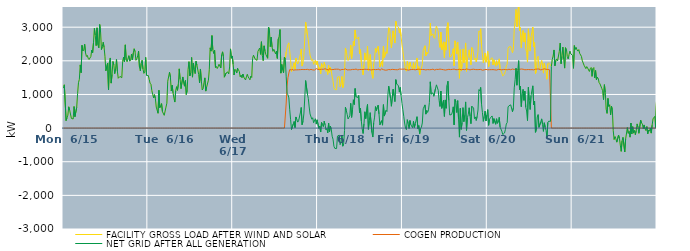
| Category | FACILITY GROSS LOAD AFTER WIND AND SOLAR | COGEN PRODUCTION | NET GRID AFTER ALL GENERATION |
|---|---|---|---|
|  Mon  6/15 | 1189 | 0 | 1189 |
|  Mon  6/15 | 1287 | 0 | 1287 |
|  Mon  6/15 | 1297 | 0 | 1297 |
|  Mon  6/15 | 224 | 0 | 224 |
|  Mon  6/15 | 304 | 0 | 304 |
|  Mon  6/15 | 385 | 0 | 385 |
|  Mon  6/15 | 633 | 0 | 633 |
|  Mon  6/15 | 533 | 0 | 533 |
|  Mon  6/15 | 510 | 0 | 510 |
|  Mon  6/15 | 287 | 0 | 287 |
|  Mon  6/15 | 264 | 0 | 264 |
|  Mon  6/15 | 271 | 0 | 271 |
|  Mon  6/15 | 641 | 0 | 641 |
|  Mon  6/15 | 338 | 0 | 338 |
|  Mon  6/15 | 337 | 0 | 337 |
|  Mon  6/15 | 616 | 0 | 616 |
|  Mon  6/15 | 1022 | 0 | 1022 |
|  Mon  6/15 | 1348 | 0 | 1348 |
|  Mon  6/15 | 1450 | 0 | 1450 |
|  Mon  6/15 | 1878 | 0 | 1878 |
|  Mon  6/15 | 1647 | 0 | 1647 |
|  Mon  6/15 | 2461 | 0 | 2461 |
|  Mon  6/15 | 2292 | 0 | 2292 |
|  Mon  6/15 | 2328 | 0 | 2328 |
|  Mon  6/15 | 2493 | 0 | 2493 |
|  Mon  6/15 | 2235 | 0 | 2235 |
|  Mon  6/15 | 2130 | 0 | 2130 |
|  Mon  6/15 | 2161 | 0 | 2161 |
|  Mon  6/15 | 2076 | 0 | 2076 |
|  Mon  6/15 | 2040 | 0 | 2040 |
|  Mon  6/15 | 2017 | 0 | 2017 |
|  Mon  6/15 | 2129 | 0 | 2129 |
|  Mon  6/15 | 2317 | 0 | 2317 |
|  Mon  6/15 | 2235 | 0 | 2235 |
|  Mon  6/15 | 2535 | 0 | 2535 |
|  Mon  6/15 | 2966 | 0 | 2966 |
|  Mon  6/15 | 2761 | 0 | 2761 |
|  Mon  6/15 | 2452 | 0 | 2452 |
|  Mon  6/15 | 2980 | 0 | 2980 |
|  Mon  6/15 | 2474 | 0 | 2474 |
|  Mon  6/15 | 2386 | 0 | 2386 |
|  Mon  6/15 | 3079 | 0 | 3079 |
|  Mon  6/15 | 2858 | 0 | 2858 |
|  Mon  6/15 | 2334 | 0 | 2334 |
|  Mon  6/15 | 2425 | 0 | 2425 |
|  Mon  6/15 | 2552 | 0 | 2552 |
|  Mon  6/15 | 2398 | 0 | 2398 |
|  Mon  6/15 | 2120 | 0 | 2120 |
|  Mon  6/15 | 1703 | 0 | 1703 |
|  Mon  6/15 | 1725 | 0 | 1725 |
|  Mon  6/15 | 1934 | 0 | 1934 |
|  Mon  6/15 | 1132 | 0 | 1132 |
|  Mon  6/15 | 1962 | 0 | 1962 |
|  Mon  6/15 | 2085 | 0 | 2085 |
|  Mon  6/15 | 1337 | 0 | 1337 |
|  Mon  6/15 | 1595 | 0 | 1595 |
|  Mon  6/15 | 1979 | 0 | 1979 |
|  Mon  6/15 | 1881 | 0 | 1881 |
|  Mon  6/15 | 1618 | 0 | 1618 |
|  Mon  6/15 | 1775 | 0 | 1775 |
|  Mon  6/15 | 2041 | 0 | 2041 |
|  Mon  6/15 | 1698 | 0 | 1698 |
|  Mon  6/15 | 1481 | 0 | 1481 |
|  Mon  6/15 | 1464 | 0 | 1464 |
|  Mon  6/15 | 1537 | 0 | 1537 |
|  Mon  6/15 | 1525 | 0 | 1525 |
|  Mon  6/15 | 1496 | 0 | 1496 |
|  Mon  6/15 | 1984 | 0 | 1984 |
|  Mon  6/15 | 2110 | 0 | 2110 |
|  Mon  6/15 | 1967 | 0 | 1967 |
|  Mon  6/15 | 2475 | 0 | 2475 |
|  Mon  6/15 | 2021 | 0 | 2021 |
|  Mon  6/15 | 1973 | 0 | 1973 |
|  Mon  6/15 | 1949 | 0 | 1949 |
|  Mon  6/15 | 2152 | 0 | 2152 |
|  Mon  6/15 | 1990 | 0 | 1990 |
|  Mon  6/15 | 2025 | 0 | 2025 |
|  Mon  6/15 | 2201 | 0 | 2201 |
|  Mon  6/15 | 2024 | 0 | 2024 |
|  Mon  6/15 | 2230 | 0 | 2230 |
|  Mon  6/15 | 2358 | 0 | 2358 |
|  Mon  6/15 | 2274 | 0 | 2274 |
|  Mon  6/15 | 2017 | 0 | 2017 |
|  Mon  6/15 | 2063 | 0 | 2063 |
|  Mon  6/15 | 2148 | 0 | 2148 |
|  Mon  6/15 | 2287 | 0 | 2287 |
|  Mon  6/15 | 1818 | 0 | 1818 |
|  Mon  6/15 | 1701 | 0 | 1701 |
|  Mon  6/15 | 1924 | 0 | 1924 |
|  Mon  6/15 | 2013 | 0 | 2013 |
|  Mon  6/15 | 1758 | 0 | 1758 |
|  Mon  6/15 | 1627 | 0 | 1627 |
|  Mon  6/15 | 1663 | 0 | 1663 |
|  Mon  6/15 | 2102 | 0 | 2102 |
|  Mon  6/15 | 1569 | 0 | 1569 |
|  Mon  6/15 | 1593 | 0 | 1593 |
|  Tue  6/16 | 1562 | 0 | 1562 |
|  Tue  6/16 | 1452 | 0 | 1452 |
|  Tue  6/16 | 1335 | 0 | 1335 |
|  Tue  6/16 | 1305 | 0 | 1305 |
|  Tue  6/16 | 1116 | 0 | 1116 |
|  Tue  6/16 | 1003 | 0 | 1003 |
|  Tue  6/16 | 898 | 0 | 898 |
|  Tue  6/16 | 992 | 0 | 992 |
|  Tue  6/16 | 882 | 0 | 882 |
|  Tue  6/16 | 625 | 0 | 625 |
|  Tue  6/16 | 604 | 0 | 604 |
|  Tue  6/16 | 441 | 0 | 441 |
|  Tue  6/16 | 1124 | 0 | 1124 |
|  Tue  6/16 | 606 | 0 | 606 |
|  Tue  6/16 | 662 | 0 | 662 |
|  Tue  6/16 | 728 | 0 | 728 |
|  Tue  6/16 | 489 | 0 | 489 |
|  Tue  6/16 | 495 | 0 | 495 |
|  Tue  6/16 | 379 | 0 | 379 |
|  Tue  6/16 | 408 | 0 | 408 |
|  Tue  6/16 | 624 | 0 | 624 |
|  Tue  6/16 | 741 | 0 | 741 |
|  Tue  6/16 | 1394 | 0 | 1394 |
|  Tue  6/16 | 1409 | 0 | 1409 |
|  Tue  6/16 | 1660 | 0 | 1660 |
|  Tue  6/16 | 1519 | 0 | 1519 |
|  Tue  6/16 | 1103 | 0 | 1103 |
|  Tue  6/16 | 1274 | 0 | 1274 |
|  Tue  6/16 | 1047 | 0 | 1047 |
|  Tue  6/16 | 889 | 0 | 889 |
|  Tue  6/16 | 774 | 0 | 774 |
|  Tue  6/16 | 1114 | 0 | 1114 |
|  Tue  6/16 | 1230 | 0 | 1230 |
|  Tue  6/16 | 1122 | 0 | 1122 |
|  Tue  6/16 | 1305 | 0 | 1305 |
|  Tue  6/16 | 1761 | 0 | 1761 |
|  Tue  6/16 | 1448 | 0 | 1448 |
|  Tue  6/16 | 1172 | 0 | 1172 |
|  Tue  6/16 | 1156 | 0 | 1156 |
|  Tue  6/16 | 1520 | 0 | 1520 |
|  Tue  6/16 | 1539 | 0 | 1539 |
|  Tue  6/16 | 1247 | 0 | 1247 |
|  Tue  6/16 | 1416 | 0 | 1416 |
|  Tue  6/16 | 1001 | 0 | 1001 |
|  Tue  6/16 | 1123 | 0 | 1123 |
|  Tue  6/16 | 1735 | 0 | 1735 |
|  Tue  6/16 | 1973 | 0 | 1973 |
|  Tue  6/16 | 1552 | 0 | 1552 |
|  Tue  6/16 | 1647 | 0 | 1647 |
|  Tue  6/16 | 2100 | 0 | 2100 |
|  Tue  6/16 | 1515 | 0 | 1515 |
|  Tue  6/16 | 1935 | 0 | 1935 |
|  Tue  6/16 | 1736 | 0 | 1736 |
|  Tue  6/16 | 1621 | 0 | 1621 |
|  Tue  6/16 | 1985 | 0 | 1985 |
|  Tue  6/16 | 1870 | 0 | 1870 |
|  Tue  6/16 | 1895 | 0 | 1895 |
|  Tue  6/16 | 1594 | 0 | 1594 |
|  Tue  6/16 | 1345 | 0 | 1345 |
|  Tue  6/16 | 1757 | 0 | 1757 |
|  Tue  6/16 | 1405 | 0 | 1405 |
|  Tue  6/16 | 1133 | 0 | 1133 |
|  Tue  6/16 | 1170 | 0 | 1170 |
|  Tue  6/16 | 1352 | 0 | 1352 |
|  Tue  6/16 | 1493 | 0 | 1493 |
|  Tue  6/16 | 1100 | 0 | 1100 |
|  Tue  6/16 | 1221 | 0 | 1221 |
|  Tue  6/16 | 1244 | 0 | 1244 |
|  Tue  6/16 | 1425 | 0 | 1425 |
|  Tue  6/16 | 1733 | 0 | 1733 |
|  Tue  6/16 | 2385 | 0 | 2385 |
|  Tue  6/16 | 2288 | 0 | 2288 |
|  Tue  6/16 | 2750 | 0 | 2750 |
|  Tue  6/16 | 2328 | 0 | 2328 |
|  Tue  6/16 | 2220 | 0 | 2220 |
|  Tue  6/16 | 2318 | 0 | 2318 |
|  Tue  6/16 | 1801 | 0 | 1801 |
|  Tue  6/16 | 1832 | 0 | 1832 |
|  Tue  6/16 | 1771 | 0 | 1771 |
|  Tue  6/16 | 1824 | 0 | 1824 |
|  Tue  6/16 | 1897 | 0 | 1897 |
|  Tue  6/16 | 1904 | 0 | 1904 |
|  Tue  6/16 | 1787 | 0 | 1787 |
|  Tue  6/16 | 2182 | 0 | 2182 |
|  Tue  6/16 | 2267 | 0 | 2267 |
|  Tue  6/16 | 2125 | 0 | 2125 |
|  Tue  6/16 | 1513 | 0 | 1513 |
|  Tue  6/16 | 1509 | 0 | 1509 |
|  Tue  6/16 | 1638 | 0 | 1638 |
|  Tue  6/16 | 1616 | 0 | 1616 |
|  Tue  6/16 | 1670 | 0 | 1670 |
|  Tue  6/16 | 1609 | 0 | 1609 |
|  Tue  6/16 | 1818 | 0 | 1818 |
|  Tue  6/16 | 2355 | 0 | 2355 |
|  Tue  6/16 | 2077 | 0 | 2077 |
|  Tue  6/16 | 2144 | 0 | 2144 |
|  Wed  6/17 | 1897 | 0 | 1897 |
|  Wed  6/17 | 1578 | 0 | 1578 |
|  Wed  6/17 | 1745 | 0 | 1745 |
|  Wed  6/17 | 1712 | 0 | 1712 |
|  Wed  6/17 | 1637 | 0 | 1637 |
|  Wed  6/17 | 1781 | 0 | 1781 |
|  Wed  6/17 | 1731 | 0 | 1731 |
|  Wed  6/17 | 1681 | 0 | 1681 |
|  Wed  6/17 | 1523 | 0 | 1523 |
|  Wed  6/17 | 1577 | 0 | 1577 |
|  Wed  6/17 | 1493 | 0 | 1493 |
|  Wed  6/17 | 1608 | 0 | 1608 |
|  Wed  6/17 | 1515 | 0 | 1515 |
|  Wed  6/17 | 1514 | 0 | 1514 |
|  Wed  6/17 | 1431 | 0 | 1431 |
|  Wed  6/17 | 1523 | 0 | 1523 |
|  Wed  6/17 | 1600 | 0 | 1600 |
|  Wed  6/17 | 1522 | 0 | 1522 |
|  Wed  6/17 | 1480 | 0 | 1480 |
|  Wed  6/17 | 1435 | 0 | 1435 |
|  Wed  6/17 | 1547 | 0 | 1547 |
|  Wed  6/17 | 1504 | 0 | 1504 |
|  Wed  6/17 | 2076 | 0 | 2076 |
|  Wed  6/17 | 2167 | 0 | 2167 |
|  Wed  6/17 | 2164 | 0 | 2164 |
|  Wed  6/17 | 2047 | 0 | 2047 |
|  Wed  6/17 | 2029 | 0 | 2029 |
|  Wed  6/17 | 2017 | 0 | 2017 |
|  Wed  6/17 | 2278 | 0 | 2278 |
|  Wed  6/17 | 2334 | 0 | 2334 |
|  Wed  6/17 | 2380 | 0 | 2380 |
|  Wed  6/17 | 2192 | 0 | 2192 |
|  Wed  6/17 | 2567 | 0 | 2567 |
|  Wed  6/17 | 2159 | 0 | 2159 |
|  Wed  6/17 | 2009 | 0 | 2009 |
|  Wed  6/17 | 2446 | 0 | 2446 |
|  Wed  6/17 | 2296 | 0 | 2296 |
|  Wed  6/17 | 2187 | 0 | 2187 |
|  Wed  6/17 | 2187 | 0 | 2187 |
|  Wed  6/17 | 2076 | 0 | 2076 |
|  Wed  6/17 | 3005 | 0 | 3005 |
|  Wed  6/17 | 2922 | 0 | 2922 |
|  Wed  6/17 | 2421 | 0 | 2421 |
|  Wed  6/17 | 2705 | 0 | 2705 |
|  Wed  6/17 | 2412 | 0 | 2412 |
|  Wed  6/17 | 2282 | 0 | 2282 |
|  Wed  6/17 | 2342 | 0 | 2342 |
|  Wed  6/17 | 2325 | 0 | 2325 |
|  Wed  6/17 | 2205 | 0 | 2205 |
|  Wed  6/17 | 2289 | 0 | 2289 |
|  Wed  6/17 | 2071 | 0 | 2071 |
|  Wed  6/17 | 2648 | 0 | 2648 |
|  Wed  6/17 | 2723 | 0 | 2723 |
|  Wed  6/17 | 2930 | 0 | 2930 |
|  Wed  6/17 | 1634 | 0 | 1634 |
|  Wed  6/17 | 1892 | 0 | 1892 |
|  Wed  6/17 | 1732 | 0 | 1732 |
|  Wed  6/17 | 1643 | 0 | 1643 |
|  Wed  6/17 | 2112 | 0 | 2112 |
|  Wed  6/17 | 2046 | 0 | 2046 |
|  Wed  6/17 | 2270 | 745 | 1525 |
|  Wed  6/17 | 2284 | 1247 | 1037 |
|  Wed  6/17 | 2488 | 1498 | 990 |
|  Wed  6/17 | 2535 | 1637 | 898 |
|  Wed  6/17 | 2285 | 1741 | 544 |
|  Wed  6/17 | 1999 | 1752 | 247 |
|  Wed  6/17 | 1680 | 1724 | -44 |
|  Wed  6/17 | 1691 | 1754 | -63 |
|  Wed  6/17 | 1842 | 1720 | 122 |
|  Wed  6/17 | 1943 | 1746 | 197 |
|  Wed  6/17 | 1747 | 1731 | 16 |
|  Wed  6/17 | 2078 | 1747 | 331 |
|  Wed  6/17 | 1993 | 1731 | 262 |
|  Wed  6/17 | 1907 | 1730 | 177 |
|  Wed  6/17 | 1949 | 1734 | 215 |
|  Wed  6/17 | 2080 | 1750 | 330 |
|  Wed  6/17 | 2186 | 1737 | 449 |
|  Wed  6/17 | 2344 | 1732 | 612 |
|  Wed  6/17 | 1844 | 1743 | 101 |
|  Wed  6/17 | 1937 | 1737 | 200 |
|  Wed  6/17 | 2159 | 1740 | 419 |
|  Wed  6/17 | 2651 | 1756 | 895 |
|  Wed  6/17 | 3154 | 1741 | 1413 |
|  Wed  6/17 | 3182 | 1750 | 1432 |
|  Wed  6/17 | 2763 | 1747 | 1016 |
|  Wed  6/17 | 2626 | 1742 | 884 |
|  Wed  6/17 | 2358 | 1730 | 628 |
|  Wed  6/17 | 2163 | 1743 | 420 |
|  Wed  6/17 | 2155 | 1745 | 410 |
|  Wed  6/17 | 2005 | 1741 | 264 |
|  Wed  6/17 | 2038 | 1730 | 308 |
|  Wed  6/17 | 1896 | 1737 | 159 |
|  Wed  6/17 | 1888 | 1726 | 162 |
|  Wed  6/17 | 2018 | 1739 | 279 |
|  Wed  6/17 | 1885 | 1767 | 118 |
|  Wed  6/17 | 1991 | 1745 | 246 |
|  Thu  6/18 | 1977 | 1746 | 231 |
|  Thu  6/18 | 1731 | 1743 | -12 |
|  Thu  6/18 | 1802 | 1745 | 57 |
|  Thu  6/18 | 1615 | 1732 | -117 |
|  Thu  6/18 | 1916 | 1749 | 167 |
|  Thu  6/18 | 1843 | 1739 | 104 |
|  Thu  6/18 | 1788 | 1748 | 40 |
|  Thu  6/18 | 1953 | 1747 | 206 |
|  Thu  6/18 | 1859 | 1763 | 96 |
|  Thu  6/18 | 1687 | 1743 | -56 |
|  Thu  6/18 | 1736 | 1746 | -10 |
|  Thu  6/18 | 1593 | 1736 | -143 |
|  Thu  6/18 | 1870 | 1724 | 146 |
|  Thu  6/18 | 1653 | 1769 | -116 |
|  Thu  6/18 | 1806 | 1744 | 62 |
|  Thu  6/18 | 1698 | 1739 | -41 |
|  Thu  6/18 | 1517 | 1759 | -242 |
|  Thu  6/18 | 1407 | 1739 | -332 |
|  Thu  6/18 | 1200 | 1740 | -540 |
|  Thu  6/18 | 1147 | 1750 | -603 |
|  Thu  6/18 | 1139 | 1740 | -601 |
|  Thu  6/18 | 1142 | 1751 | -609 |
|  Thu  6/18 | 1511 | 1749 | -238 |
|  Thu  6/18 | 1505 | 1751 | -246 |
|  Thu  6/18 | 1532 | 1742 | -210 |
|  Thu  6/18 | 1232 | 1725 | -493 |
|  Thu  6/18 | 1298 | 1735 | -437 |
|  Thu  6/18 | 1534 | 1743 | -209 |
|  Thu  6/18 | 1203 | 1741 | -538 |
|  Thu  6/18 | 1277 | 1742 | -465 |
|  Thu  6/18 | 1670 | 1742 | -72 |
|  Thu  6/18 | 2382 | 1761 | 621 |
|  Thu  6/18 | 2265 | 1744 | 521 |
|  Thu  6/18 | 2138 | 1730 | 408 |
|  Thu  6/18 | 2009 | 1738 | 271 |
|  Thu  6/18 | 2052 | 1732 | 320 |
|  Thu  6/18 | 2116 | 1754 | 362 |
|  Thu  6/18 | 2467 | 1732 | 735 |
|  Thu  6/18 | 2067 | 1748 | 319 |
|  Thu  6/18 | 2286 | 1745 | 541 |
|  Thu  6/18 | 2578 | 1736 | 842 |
|  Thu  6/18 | 2443 | 1743 | 700 |
|  Thu  6/18 | 2918 | 1741 | 1177 |
|  Thu  6/18 | 2687 | 1755 | 932 |
|  Thu  6/18 | 2652 | 1739 | 913 |
|  Thu  6/18 | 2639 | 1730 | 909 |
|  Thu  6/18 | 2709 | 1737 | 972 |
|  Thu  6/18 | 2202 | 1741 | 461 |
|  Thu  6/18 | 2336 | 1745 | 591 |
|  Thu  6/18 | 1952 | 1742 | 210 |
|  Thu  6/18 | 1733 | 1757 | -24 |
|  Thu  6/18 | 1580 | 1740 | -160 |
|  Thu  6/18 | 1869 | 1743 | 126 |
|  Thu  6/18 | 2236 | 1750 | 486 |
|  Thu  6/18 | 2019 | 1737 | 282 |
|  Thu  6/18 | 2051 | 1745 | 306 |
|  Thu  6/18 | 2441 | 1739 | 702 |
|  Thu  6/18 | 1709 | 1747 | -38 |
|  Thu  6/18 | 1963 | 1757 | 206 |
|  Thu  6/18 | 2189 | 1730 | 459 |
|  Thu  6/18 | 2176 | 1741 | 435 |
|  Thu  6/18 | 1599 | 1733 | -134 |
|  Thu  6/18 | 1480 | 1746 | -266 |
|  Thu  6/18 | 1903 | 1743 | 160 |
|  Thu  6/18 | 2075 | 1749 | 326 |
|  Thu  6/18 | 2378 | 1738 | 640 |
|  Thu  6/18 | 2254 | 1738 | 516 |
|  Thu  6/18 | 2360 | 1743 | 617 |
|  Thu  6/18 | 2432 | 1749 | 683 |
|  Thu  6/18 | 2178 | 1756 | 422 |
|  Thu  6/18 | 1815 | 1718 | 97 |
|  Thu  6/18 | 1842 | 1747 | 95 |
|  Thu  6/18 | 1982 | 1760 | 222 |
|  Thu  6/18 | 1833 | 1747 | 86 |
|  Thu  6/18 | 2435 | 1738 | 697 |
|  Thu  6/18 | 2089 | 1732 | 357 |
|  Thu  6/18 | 2075 | 1722 | 353 |
|  Thu  6/18 | 2270 | 1743 | 527 |
|  Thu  6/18 | 2218 | 1725 | 493 |
|  Thu  6/18 | 2704 | 1723 | 981 |
|  Thu  6/18 | 2989 | 1742 | 1247 |
|  Thu  6/18 | 2952 | 1734 | 1218 |
|  Thu  6/18 | 2625 | 1735 | 890 |
|  Thu  6/18 | 2387 | 1738 | 649 |
|  Thu  6/18 | 2392 | 1747 | 645 |
|  Thu  6/18 | 2891 | 1738 | 1153 |
|  Thu  6/18 | 2697 | 1740 | 957 |
|  Thu  6/18 | 2528 | 1741 | 787 |
|  Thu  6/18 | 3176 | 1736 | 1440 |
|  Thu  6/18 | 3055 | 1747 | 1308 |
|  Thu  6/18 | 3027 | 1734 | 1293 |
|  Thu  6/18 | 3003 | 1740 | 1263 |
|  Thu  6/18 | 2825 | 1755 | 1070 |
|  Thu  6/18 | 2954 | 1745 | 1209 |
|  Thu  6/18 | 2724 | 1751 | 973 |
|  Thu  6/18 | 2467 | 1740 | 727 |
|  Fri  6/19 | 2297 | 1752 | 545 |
|  Fri  6/19 | 2086 | 1735 | 351 |
|  Fri  6/19 | 1905 | 1754 | 151 |
|  Fri  6/19 | 1738 | 1742 | -4 |
|  Fri  6/19 | 1692 | 1739 | -47 |
|  Fri  6/19 | 1983 | 1732 | 251 |
|  Fri  6/19 | 1855 | 1722 | 133 |
|  Fri  6/19 | 1731 | 1745 | -14 |
|  Fri  6/19 | 1961 | 1735 | 226 |
|  Fri  6/19 | 1840 | 1738 | 102 |
|  Fri  6/19 | 1815 | 1742 | 73 |
|  Fri  6/19 | 1759 | 1749 | 10 |
|  Fri  6/19 | 1946 | 1744 | 202 |
|  Fri  6/19 | 1751 | 1732 | 19 |
|  Fri  6/19 | 1858 | 1732 | 126 |
|  Fri  6/19 | 1857 | 1742 | 115 |
|  Fri  6/19 | 2085 | 1746 | 339 |
|  Fri  6/19 | 1729 | 1746 | -17 |
|  Fri  6/19 | 1826 | 1752 | 74 |
|  Fri  6/19 | 1578 | 1744 | -166 |
|  Fri  6/19 | 1730 | 1746 | -16 |
|  Fri  6/19 | 1783 | 1756 | 27 |
|  Fri  6/19 | 1894 | 1742 | 152 |
|  Fri  6/19 | 2309 | 1735 | 574 |
|  Fri  6/19 | 2289 | 1740 | 549 |
|  Fri  6/19 | 2448 | 1758 | 690 |
|  Fri  6/19 | 2144 | 1729 | 415 |
|  Fri  6/19 | 2258 | 1732 | 526 |
|  Fri  6/19 | 2205 | 1740 | 465 |
|  Fri  6/19 | 2284 | 1742 | 542 |
|  Fri  6/19 | 2500 | 1735 | 765 |
|  Fri  6/19 | 3119 | 1743 | 1376 |
|  Fri  6/19 | 2746 | 1739 | 1007 |
|  Fri  6/19 | 2734 | 1741 | 993 |
|  Fri  6/19 | 2801 | 1752 | 1049 |
|  Fri  6/19 | 2696 | 1750 | 946 |
|  Fri  6/19 | 2666 | 1726 | 940 |
|  Fri  6/19 | 2932 | 1746 | 1186 |
|  Fri  6/19 | 3032 | 1746 | 1286 |
|  Fri  6/19 | 3028 | 1749 | 1279 |
|  Fri  6/19 | 2867 | 1743 | 1124 |
|  Fri  6/19 | 2571 | 1751 | 820 |
|  Fri  6/19 | 2397 | 1754 | 643 |
|  Fri  6/19 | 2852 | 1751 | 1101 |
|  Fri  6/19 | 2330 | 1744 | 586 |
|  Fri  6/19 | 2308 | 1732 | 576 |
|  Fri  6/19 | 2564 | 1736 | 828 |
|  Fri  6/19 | 2093 | 1746 | 347 |
|  Fri  6/19 | 2562 | 1725 | 837 |
|  Fri  6/19 | 2318 | 1729 | 589 |
|  Fri  6/19 | 3004 | 1735 | 1269 |
|  Fri  6/19 | 3135 | 1741 | 1394 |
|  Fri  6/19 | 2568 | 1747 | 821 |
|  Fri  6/19 | 2110 | 1721 | 389 |
|  Fri  6/19 | 2106 | 1739 | 367 |
|  Fri  6/19 | 2144 | 1742 | 402 |
|  Fri  6/19 | 2225 | 1746 | 479 |
|  Fri  6/19 | 2363 | 1731 | 632 |
|  Fri  6/19 | 1850 | 1754 | 96 |
|  Fri  6/19 | 2595 | 1744 | 851 |
|  Fri  6/19 | 2511 | 1735 | 776 |
|  Fri  6/19 | 2202 | 1739 | 463 |
|  Fri  6/19 | 2554 | 1738 | 816 |
|  Fri  6/19 | 2000 | 1733 | 267 |
|  Fri  6/19 | 1480 | 1749 | -269 |
|  Fri  6/19 | 2332 | 1746 | 586 |
|  Fri  6/19 | 1696 | 1733 | -37 |
|  Fri  6/19 | 1890 | 1728 | 162 |
|  Fri  6/19 | 2354 | 1746 | 608 |
|  Fri  6/19 | 1939 | 1747 | 192 |
|  Fri  6/19 | 2120 | 1736 | 384 |
|  Fri  6/19 | 2532 | 1754 | 778 |
|  Fri  6/19 | 1688 | 1757 | -69 |
|  Fri  6/19 | 2045 | 1737 | 308 |
|  Fri  6/19 | 2157 | 1747 | 410 |
|  Fri  6/19 | 2326 | 1722 | 604 |
|  Fri  6/19 | 2088 | 1730 | 358 |
|  Fri  6/19 | 1882 | 1751 | 131 |
|  Fri  6/19 | 2397 | 1746 | 651 |
|  Fri  6/19 | 2360 | 1737 | 623 |
|  Fri  6/19 | 2346 | 1750 | 596 |
|  Fri  6/19 | 2030 | 1750 | 280 |
|  Fri  6/19 | 2072 | 1740 | 332 |
|  Fri  6/19 | 1965 | 1738 | 227 |
|  Fri  6/19 | 2086 | 1737 | 349 |
|  Fri  6/19 | 2277 | 1739 | 538 |
|  Fri  6/19 | 2883 | 1740 | 1143 |
|  Fri  6/19 | 2852 | 1744 | 1108 |
|  Fri  6/19 | 2954 | 1744 | 1210 |
|  Fri  6/19 | 2440 | 1729 | 711 |
|  Fri  6/19 | 2180 | 1721 | 459 |
|  Fri  6/19 | 1945 | 1744 | 201 |
|  Fri  6/19 | 2079 | 1731 | 348 |
|  Fri  6/19 | 2233 | 1730 | 503 |
|  Fri  6/19 | 1956 | 1745 | 211 |
|  Fri  6/19 | 2135 | 1748 | 387 |
|  Sat  6/20 | 2283 | 1733 | 550 |
|  Sat  6/20 | 1828 | 1745 | 83 |
|  Sat  6/20 | 1991 | 1736 | 255 |
|  Sat  6/20 | 2049 | 1741 | 308 |
|  Sat  6/20 | 2047 | 1737 | 310 |
|  Sat  6/20 | 2091 | 1730 | 361 |
|  Sat  6/20 | 1877 | 1739 | 138 |
|  Sat  6/20 | 2031 | 1749 | 282 |
|  Sat  6/20 | 2035 | 1732 | 303 |
|  Sat  6/20 | 1841 | 1726 | 115 |
|  Sat  6/20 | 2002 | 1725 | 277 |
|  Sat  6/20 | 1871 | 1731 | 140 |
|  Sat  6/20 | 1927 | 1745 | 182 |
|  Sat  6/20 | 2060 | 1741 | 319 |
|  Sat  6/20 | 1768 | 1741 | 27 |
|  Sat  6/20 | 1794 | 1742 | 52 |
|  Sat  6/20 | 1640 | 1732 | -92 |
|  Sat  6/20 | 1552 | 1745 | -193 |
|  Sat  6/20 | 1543 | 1744 | -201 |
|  Sat  6/20 | 1601 | 1747 | -146 |
|  Sat  6/20 | 1701 | 1741 | -40 |
|  Sat  6/20 | 1849 | 1727 | 122 |
|  Sat  6/20 | 1895 | 1733 | 162 |
|  Sat  6/20 | 2367 | 1739 | 628 |
|  Sat  6/20 | 2414 | 1750 | 664 |
|  Sat  6/20 | 2394 | 1755 | 639 |
|  Sat  6/20 | 2426 | 1735 | 691 |
|  Sat  6/20 | 2438 | 1728 | 710 |
|  Sat  6/20 | 2241 | 1755 | 486 |
|  Sat  6/20 | 2332 | 1737 | 595 |
|  Sat  6/20 | 2939 | 1743 | 1196 |
|  Sat  6/20 | 3185 | 1745 | 1440 |
|  Sat  6/20 | 3526 | 1745 | 1781 |
|  Sat  6/20 | 3012 | 1737 | 1275 |
|  Sat  6/20 | 3438 | 1735 | 1703 |
|  Sat  6/20 | 3746 | 1740 | 2006 |
|  Sat  6/20 | 2893 | 1748 | 1145 |
|  Sat  6/20 | 2988 | 1746 | 1242 |
|  Sat  6/20 | 2394 | 1756 | 638 |
|  Sat  6/20 | 2757 | 1746 | 1011 |
|  Sat  6/20 | 2901 | 1750 | 1151 |
|  Sat  6/20 | 2561 | 1737 | 824 |
|  Sat  6/20 | 2831 | 1734 | 1097 |
|  Sat  6/20 | 2367 | 1742 | 625 |
|  Sat  6/20 | 2246 | 1737 | 509 |
|  Sat  6/20 | 1961 | 1739 | 222 |
|  Sat  6/20 | 2952 | 1741 | 1211 |
|  Sat  6/20 | 2573 | 1753 | 820 |
|  Sat  6/20 | 2289 | 1736 | 553 |
|  Sat  6/20 | 2714 | 1744 | 970 |
|  Sat  6/20 | 2697 | 1738 | 959 |
|  Sat  6/20 | 3005 | 1749 | 1256 |
|  Sat  6/20 | 2421 | 1731 | 690 |
|  Sat  6/20 | 2543 | 1738 | 805 |
|  Sat  6/20 | 1622 | 1750 | -128 |
|  Sat  6/20 | 1681 | 1761 | -80 |
|  Sat  6/20 | 2084 | 1755 | 329 |
|  Sat  6/20 | 2137 | 1737 | 400 |
|  Sat  6/20 | 1779 | 1756 | 23 |
|  Sat  6/20 | 1738 | 1739 | -1 |
|  Sat  6/20 | 1909 | 1730 | 179 |
|  Sat  6/20 | 2012 | 1738 | 274 |
|  Sat  6/20 | 1858 | 1745 | 113 |
|  Sat  6/20 | 1634 | 1731 | -97 |
|  Sat  6/20 | 1920 | 1762 | 158 |
|  Sat  6/20 | 1777 | 1747 | 30 |
|  Sat  6/20 | 1676 | 1748 | -72 |
|  Sat  6/20 | 1453 | 1734 | -281 |
|  Sat  6/20 | 1911 | 1743 | 168 |
|  Sat  6/20 | 1943 | 1737 | 206 |
|  Sat  6/20 | 1909 | 1731 | 178 |
|  Sat  6/20 | 1929 | 1730 | 199 |
|  Sat  6/20 | 1836 | 0 | 1836 |
|  Sat  6/20 | 2040 | 0 | 2040 |
|  Sat  6/20 | 2142 | 0 | 2142 |
|  Sat  6/20 | 2323 | 0 | 2323 |
|  Sat  6/20 | 1852 | 0 | 1852 |
|  Sat  6/20 | 2004 | 0 | 2004 |
|  Sat  6/20 | 2056 | 0 | 2056 |
|  Sat  6/20 | 1996 | 0 | 1996 |
|  Sat  6/20 | 2002 | 0 | 2002 |
|  Sat  6/20 | 2281 | 0 | 2281 |
|  Sat  6/20 | 2527 | 0 | 2527 |
|  Sat  6/20 | 1914 | 0 | 1914 |
|  Sat  6/20 | 2131 | 0 | 2131 |
|  Sat  6/20 | 2407 | 0 | 2407 |
|  Sat  6/20 | 2050 | 0 | 2050 |
|  Sat  6/20 | 1783 | 0 | 1783 |
|  Sat  6/20 | 2391 | 0 | 2391 |
|  Sat  6/20 | 2348 | 0 | 2348 |
|  Sat  6/20 | 2129 | 0 | 2129 |
|  Sat  6/20 | 2054 | 0 | 2054 |
|  Sat  6/20 | 2187 | 0 | 2187 |
|  Sat  6/20 | 2289 | 0 | 2289 |
|  Sat  6/20 | 2205 | 0 | 2205 |
|  Sat  6/20 | 2179 | 0 | 2179 |
|  Sun  6/21 | 2162 | 0 | 2162 |
|  Sun  6/21 | 1777 | 0 | 1777 |
|  Sun  6/21 | 2452 | 0 | 2452 |
|  Sun  6/21 | 2339 | 0 | 2339 |
|  Sun  6/21 | 2400 | 0 | 2400 |
|  Sun  6/21 | 2325 | 0 | 2325 |
|  Sun  6/21 | 2289 | 0 | 2289 |
|  Sun  6/21 | 2332 | 0 | 2332 |
|  Sun  6/21 | 2222 | 0 | 2222 |
|  Sun  6/21 | 2219 | 0 | 2219 |
|  Sun  6/21 | 2132 | 0 | 2132 |
|  Sun  6/21 | 2003 | 0 | 2003 |
|  Sun  6/21 | 2028 | 0 | 2028 |
|  Sun  6/21 | 1866 | 0 | 1866 |
|  Sun  6/21 | 1878 | 0 | 1878 |
|  Sun  6/21 | 1768 | 0 | 1768 |
|  Sun  6/21 | 1828 | 0 | 1828 |
|  Sun  6/21 | 1785 | 0 | 1785 |
|  Sun  6/21 | 1802 | 0 | 1802 |
|  Sun  6/21 | 1683 | 0 | 1683 |
|  Sun  6/21 | 1765 | 0 | 1765 |
|  Sun  6/21 | 1800 | 0 | 1800 |
|  Sun  6/21 | 1538 | 0 | 1538 |
|  Sun  6/21 | 1767 | 0 | 1767 |
|  Sun  6/21 | 1799 | 0 | 1799 |
|  Sun  6/21 | 1492 | 0 | 1492 |
|  Sun  6/21 | 1711 | 0 | 1711 |
|  Sun  6/21 | 1438 | 0 | 1438 |
|  Sun  6/21 | 1512 | 0 | 1512 |
|  Sun  6/21 | 1477 | 0 | 1477 |
|  Sun  6/21 | 1351 | 0 | 1351 |
|  Sun  6/21 | 1314 | 0 | 1314 |
|  Sun  6/21 | 1330 | 0 | 1330 |
|  Sun  6/21 | 1180 | 0 | 1180 |
|  Sun  6/21 | 1111 | 0 | 1111 |
|  Sun  6/21 | 848 | 0 | 848 |
|  Sun  6/21 | 1290 | 0 | 1290 |
|  Sun  6/21 | 1063 | 0 | 1063 |
|  Sun  6/21 | 560 | 0 | 560 |
|  Sun  6/21 | 438 | 0 | 438 |
|  Sun  6/21 | 882 | 0 | 882 |
|  Sun  6/21 | 643 | 0 | 643 |
|  Sun  6/21 | 693 | 0 | 693 |
|  Sun  6/21 | 392 | 0 | 392 |
|  Sun  6/21 | 652 | 0 | 652 |
|  Sun  6/21 | 546 | 0 | 546 |
|  Sun  6/21 | -78 | 0 | -78 |
|  Sun  6/21 | -337 | 0 | -337 |
|  Sun  6/21 | -255 | 0 | -255 |
|  Sun  6/21 | -319 | 0 | -319 |
|  Sun  6/21 | -418 | 0 | -418 |
|  Sun  6/21 | -447 | 0 | -447 |
|  Sun  6/21 | -209 | 0 | -209 |
|  Sun  6/21 | -304 | 0 | -304 |
|  Sun  6/21 | -505 | 0 | -505 |
|  Sun  6/21 | -691 | 0 | -691 |
|  Sun  6/21 | -381 | 0 | -381 |
|  Sun  6/21 | -276 | 0 | -276 |
|  Sun  6/21 | -268 | 0 | -268 |
|  Sun  6/21 | -708 | 0 | -708 |
|  Sun  6/21 | -326 | 0 | -326 |
|  Sun  6/21 | -315 | 0 | -315 |
|  Sun  6/21 | 14 | 0 | 14 |
|  Sun  6/21 | -157 | 0 | -157 |
|  Sun  6/21 | -93 | 0 | -93 |
|  Sun  6/21 | -270 | 0 | -270 |
|  Sun  6/21 | 150 | 0 | 150 |
|  Sun  6/21 | -174 | 0 | -174 |
|  Sun  6/21 | 43 | 0 | 43 |
|  Sun  6/21 | -149 | 0 | -149 |
|  Sun  6/21 | -72 | 0 | -72 |
|  Sun  6/21 | -196 | 0 | -196 |
|  Sun  6/21 | -71 | 0 | -71 |
|  Sun  6/21 | 124 | 0 | 124 |
|  Sun  6/21 | 26 | 0 | 26 |
|  Sun  6/21 | -154 | 0 | -154 |
|  Sun  6/21 | -150 | 0 | -150 |
|  Sun  6/21 | 236 | 0 | 236 |
|  Sun  6/21 | 153 | 0 | 153 |
|  Sun  6/21 | 119 | 0 | 119 |
|  Sun  6/21 | -12 | 0 | -12 |
|  Sun  6/21 | 93 | 0 | 93 |
|  Sun  6/21 | -22 | 0 | -22 |
|  Sun  6/21 | -74 | 0 | -74 |
|  Sun  6/21 | 46 | 0 | 46 |
|  Sun  6/21 | -171 | 0 | -171 |
|  Sun  6/21 | -56 | 0 | -56 |
|  Sun  6/21 | -92 | 0 | -92 |
|  Sun  6/21 | 3 | 0 | 3 |
|  Sun  6/21 | -149 | 0 | -149 |
|  Sun  6/21 | 87 | 0 | 87 |
|  Sun  6/21 | 274 | 0 | 274 |
|  Sun  6/21 | 280 | 0 | 280 |
|  Sun  6/21 | 348 | 0 | 348 |
|  Sun  6/21 | 17 | 0 | 17 |
|  Sun  6/21 | 845 | 0 | 845 |